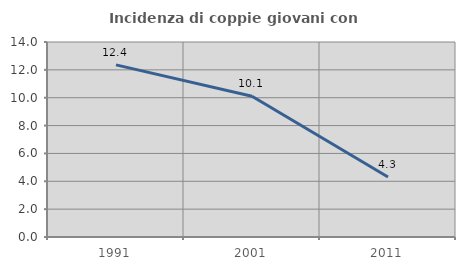
| Category | Incidenza di coppie giovani con figli |
|---|---|
| 1991.0 | 12.36 |
| 2001.0 | 10.106 |
| 2011.0 | 4.306 |